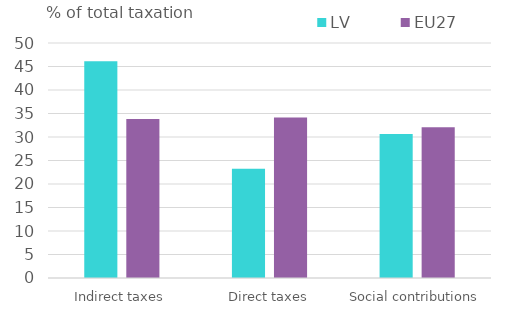
| Category | LV | EU27 |
|---|---|---|
| Indirect taxes | 46.142 | 33.811 |
| Direct taxes | 23.246 | 34.133 |
| Social contributions | 30.613 | 32.056 |